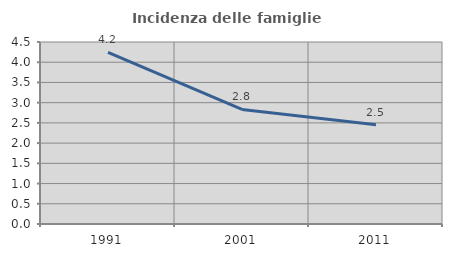
| Category | Incidenza delle famiglie numerose |
|---|---|
| 1991.0 | 4.245 |
| 2001.0 | 2.832 |
| 2011.0 | 2.451 |